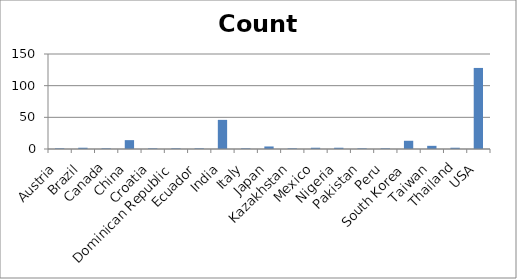
| Category | Count |
|---|---|
| Austria | 1 |
| Brazil | 2 |
| Canada | 1 |
| China | 14 |
| Croatia | 1 |
| Dominican Republic | 1 |
| Ecuador | 1 |
| India | 46 |
| Italy | 1 |
| Japan | 4 |
| Kazakhstan | 1 |
| Mexico | 2 |
| Nigeria | 2 |
| Pakistan | 1 |
| Peru | 1 |
| South Korea | 13 |
| Taiwan | 5 |
| Thailand | 2 |
| USA | 128 |